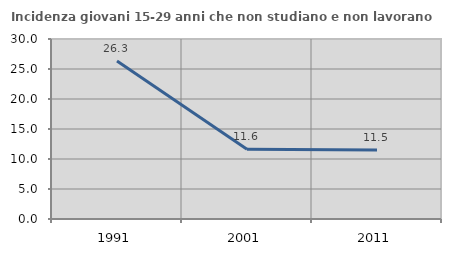
| Category | Incidenza giovani 15-29 anni che non studiano e non lavorano  |
|---|---|
| 1991.0 | 26.335 |
| 2001.0 | 11.644 |
| 2011.0 | 11.491 |